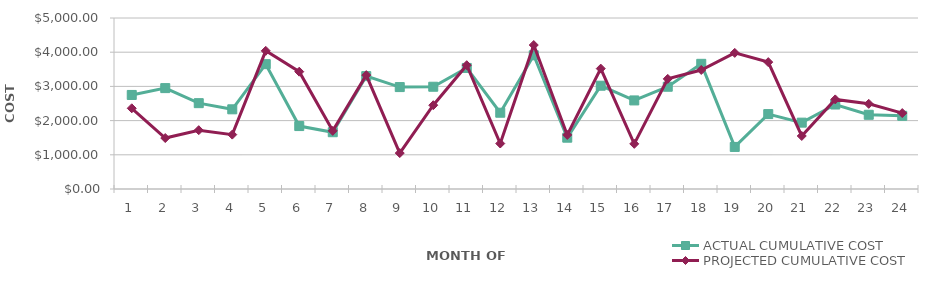
| Category | ACTUAL CUMULATIVE COST | PROJECTED CUMULATIVE COST |
|---|---|---|
| 1.0 | 2750 | 2360 |
| 2.0 | 2950 | 1490 |
| 3.0 | 2510 | 1720 |
| 4.0 | 2330 | 1590 |
| 5.0 | 3650 | 4040 |
| 6.0 | 1840 | 3430 |
| 7.0 | 1660 | 1700 |
| 8.0 | 3300 | 3330 |
| 9.0 | 2980 | 1050 |
| 10.0 | 2990 | 2450 |
| 11.0 | 3540 | 3620 |
| 12.0 | 2230 | 1330 |
| 13.0 | 3910 | 4210 |
| 14.0 | 1500 | 1580 |
| 15.0 | 3020 | 3520 |
| 16.0 | 2590 | 1320 |
| 17.0 | 2990 | 3220 |
| 18.0 | 3660 | 3480 |
| 19.0 | 1230 | 3980 |
| 20.0 | 2190 | 3710 |
| 21.0 | 1940 | 1550 |
| 22.0 | 2470 | 2620 |
| 23.0 | 2170 | 2490 |
| 24.0 | 2140 | 2220 |